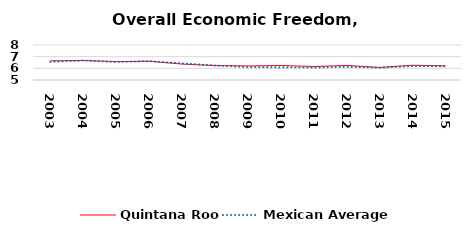
| Category | Quintana Roo | Mexican Average  |
|---|---|---|
| 2003.0 | 6.643 | 6.552 |
| 2004.0 | 6.68 | 6.668 |
| 2005.0 | 6.573 | 6.546 |
| 2006.0 | 6.608 | 6.619 |
| 2007.0 | 6.365 | 6.428 |
| 2008.0 | 6.237 | 6.248 |
| 2009.0 | 6.204 | 6.106 |
| 2010.0 | 6.241 | 6.086 |
| 2011.0 | 6.157 | 6.074 |
| 2012.0 | 6.246 | 6.134 |
| 2013.0 | 6.078 | 6.054 |
| 2014.0 | 6.266 | 6.2 |
| 2015.0 | 6.211 | 6.174 |